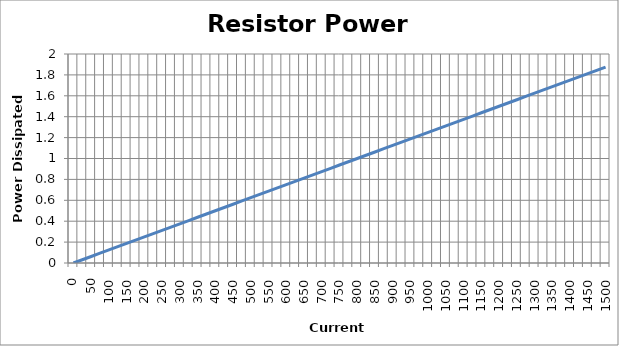
| Category | R1 Dissipation (W) |
|---|---|
| 0.0 | 0 |
| 25.0 | 0.031 |
| 50.0 | 0.062 |
| 75.0 | 0.094 |
| 100.0 | 0.125 |
| 125.0 | 0.156 |
| 150.0 | 0.188 |
| 175.0 | 0.219 |
| 200.0 | 0.25 |
| 225.0 | 0.281 |
| 250.0 | 0.312 |
| 275.0 | 0.344 |
| 300.0 | 0.375 |
| 325.0 | 0.406 |
| 350.0 | 0.438 |
| 375.0 | 0.469 |
| 400.0 | 0.5 |
| 425.0 | 0.531 |
| 450.0 | 0.562 |
| 475.0 | 0.594 |
| 500.0 | 0.625 |
| 525.0 | 0.656 |
| 550.0 | 0.688 |
| 575.0 | 0.719 |
| 600.0 | 0.75 |
| 625.0 | 0.781 |
| 650.0 | 0.812 |
| 675.0 | 0.844 |
| 700.0 | 0.875 |
| 725.0 | 0.906 |
| 750.0 | 0.938 |
| 775.0 | 0.969 |
| 800.0 | 1 |
| 825.0 | 1.031 |
| 850.0 | 1.062 |
| 875.0 | 1.094 |
| 900.0 | 1.125 |
| 925.0 | 1.156 |
| 950.0 | 1.188 |
| 975.0 | 1.219 |
| 1000.0 | 1.25 |
| 1025.0 | 1.281 |
| 1050.0 | 1.312 |
| 1075.0 | 1.344 |
| 1100.0 | 1.375 |
| 1125.0 | 1.406 |
| 1150.0 | 1.438 |
| 1175.0 | 1.469 |
| 1200.0 | 1.5 |
| 1225.0 | 1.531 |
| 1250.0 | 1.562 |
| 1275.0 | 1.594 |
| 1300.0 | 1.625 |
| 1325.0 | 1.656 |
| 1350.0 | 1.688 |
| 1375.0 | 1.719 |
| 1400.0 | 1.75 |
| 1425.0 | 1.781 |
| 1450.0 | 1.812 |
| 1475.0 | 1.844 |
| 1500.0 | 1.875 |